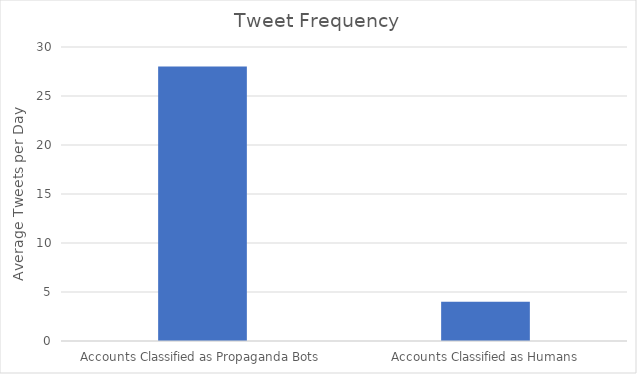
| Category | Series 0 |
|---|---|
| Accounts Classified as Propaganda Bots | 28 |
| Accounts Classified as Humans | 4 |